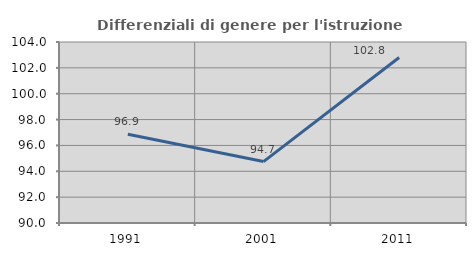
| Category | Differenziali di genere per l'istruzione superiore |
|---|---|
| 1991.0 | 96.864 |
| 2001.0 | 94.75 |
| 2011.0 | 102.801 |